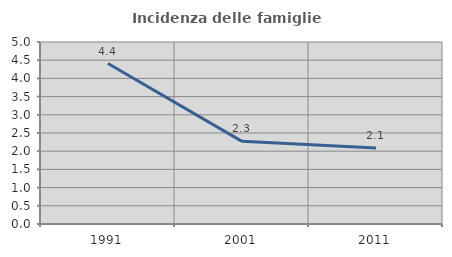
| Category | Incidenza delle famiglie numerose |
|---|---|
| 1991.0 | 4.409 |
| 2001.0 | 2.27 |
| 2011.0 | 2.088 |